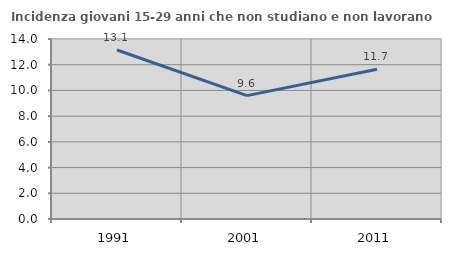
| Category | Incidenza giovani 15-29 anni che non studiano e non lavorano  |
|---|---|
| 1991.0 | 13.146 |
| 2001.0 | 9.596 |
| 2011.0 | 11.65 |